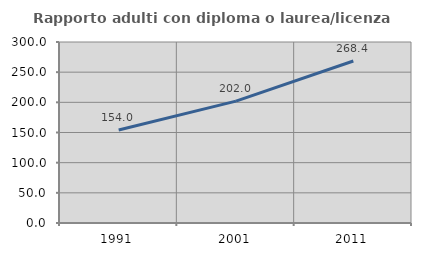
| Category | Rapporto adulti con diploma o laurea/licenza media  |
|---|---|
| 1991.0 | 154.042 |
| 2001.0 | 202.005 |
| 2011.0 | 268.442 |